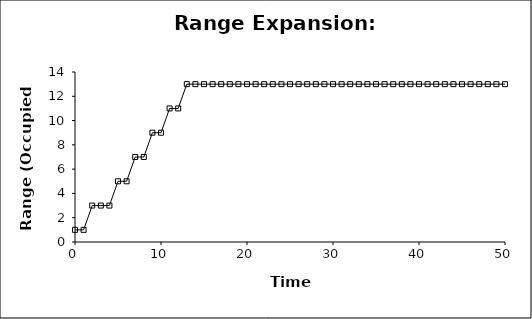
| Category | Range |
|---|---|
| 0.0 | 1 |
| 1.0 | 1 |
| 2.0 | 3 |
| 3.0 | 3 |
| 4.0 | 3 |
| 5.0 | 5 |
| 6.0 | 5 |
| 7.0 | 7 |
| 8.0 | 7 |
| 9.0 | 9 |
| 10.0 | 9 |
| 11.0 | 11 |
| 12.0 | 11 |
| 13.0 | 13 |
| 14.0 | 13 |
| 15.0 | 13 |
| 16.0 | 13 |
| 17.0 | 13 |
| 18.0 | 13 |
| 19.0 | 13 |
| 20.0 | 13 |
| 21.0 | 13 |
| 22.0 | 13 |
| 23.0 | 13 |
| 24.0 | 13 |
| 25.0 | 13 |
| 26.0 | 13 |
| 27.0 | 13 |
| 28.0 | 13 |
| 29.0 | 13 |
| 30.0 | 13 |
| 31.0 | 13 |
| 32.0 | 13 |
| 33.0 | 13 |
| 34.0 | 13 |
| 35.0 | 13 |
| 36.0 | 13 |
| 37.0 | 13 |
| 38.0 | 13 |
| 39.0 | 13 |
| 40.0 | 13 |
| 41.0 | 13 |
| 42.0 | 13 |
| 43.0 | 13 |
| 44.0 | 13 |
| 45.0 | 13 |
| 46.0 | 13 |
| 47.0 | 13 |
| 48.0 | 13 |
| 49.0 | 13 |
| 50.0 | 13 |